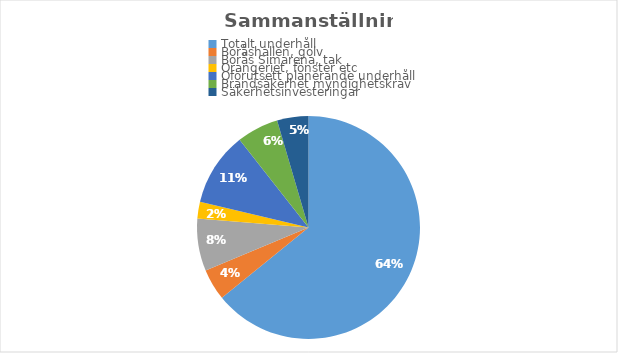
| Category | Series 0 |
|---|---|
| Totalt underhåll  | 42342452 |
| Boråshallen, golv | 3000000 |
| Borås Simarena, tak | 5000000 |
| Orangeriet, fönster etc | 1600000 |
| Oförutsett planerande underhåll | 7057548 |
| Brandsäkerhet myndighetskrav | 4000000 |
| Säkerhetsinvesteringar | 3000000 |